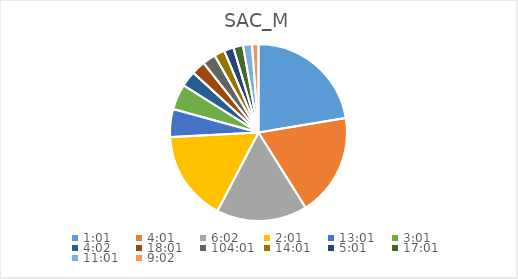
| Category | Series 0 |
|---|---|
| 0.042361111111111106 | 24.508 |
| 0.1673611111111111 | 20.498 |
| 0.2513888888888889 | 18.162 |
| 0.08402777777777777 | 18.077 |
| 0.5423611111111112 | 5.581 |
| 0.12569444444444444 | 5.109 |
| 0.16805555555555554 | 3.133 |
| 0.7506944444444444 | 2.811 |
| 4.334027777777778 | 2.618 |
| 0.5840277777777778 | 2.109 |
| 0.20902777777777778 | 1.92 |
| 0.7090277777777777 | 1.92 |
| 0.4590277777777778 | 1.793 |
| 0.3763888888888889 | 1.292 |